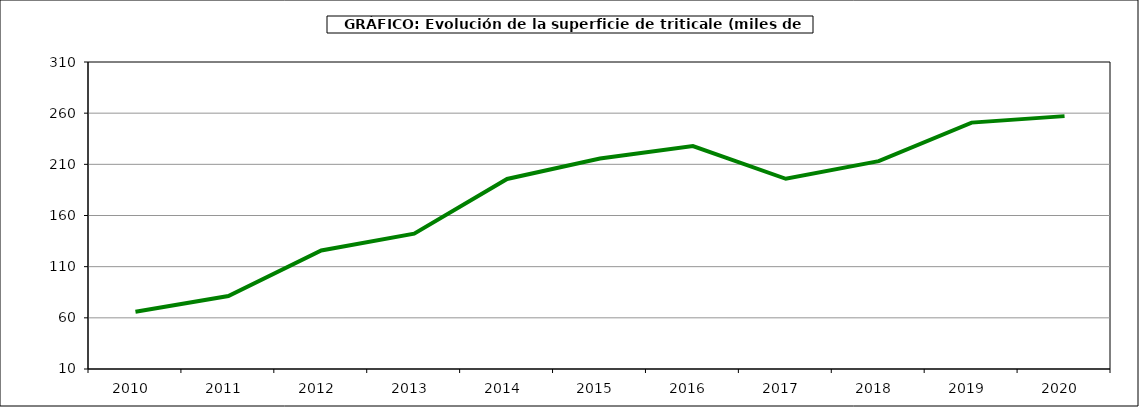
| Category | Superficie |
|---|---|
| 2010.0 | 65.984 |
| 2011.0 | 81.322 |
| 2012.0 | 125.879 |
| 2013.0 | 142.31 |
| 2014.0 | 195.684 |
| 2015.0 | 215.62 |
| 2016.0 | 227.792 |
| 2017.0 | 195.884 |
| 2018.0 | 213.091 |
| 2019.0 | 250.782 |
| 2020.0 | 257.107 |